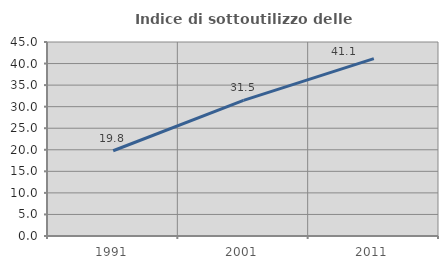
| Category | Indice di sottoutilizzo delle abitazioni  |
|---|---|
| 1991.0 | 19.774 |
| 2001.0 | 31.461 |
| 2011.0 | 41.148 |